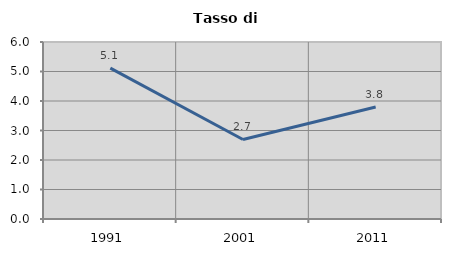
| Category | Tasso di disoccupazione   |
|---|---|
| 1991.0 | 5.116 |
| 2001.0 | 2.695 |
| 2011.0 | 3.794 |